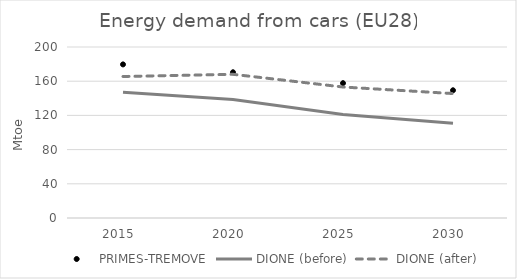
| Category | PRIMES-TREMOVE | DIONE (before) | DIONE (after) |
|---|---|---|---|
| 2015.0 | 179639.696 | 147184.559 | 165507.582 |
| 2020.0 | 170433.987 | 138565.166 | 168063.352 |
| 2025.0 | 157715.399 | 120981.779 | 153196.333 |
| 2030.0 | 149368.367 | 110802.551 | 145542.961 |